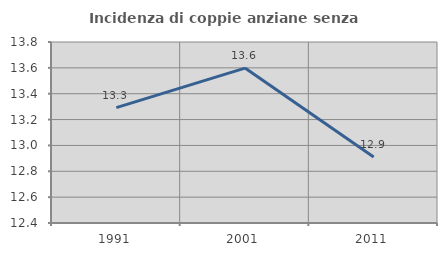
| Category | Incidenza di coppie anziane senza figli  |
|---|---|
| 1991.0 | 13.292 |
| 2001.0 | 13.598 |
| 2011.0 | 12.911 |